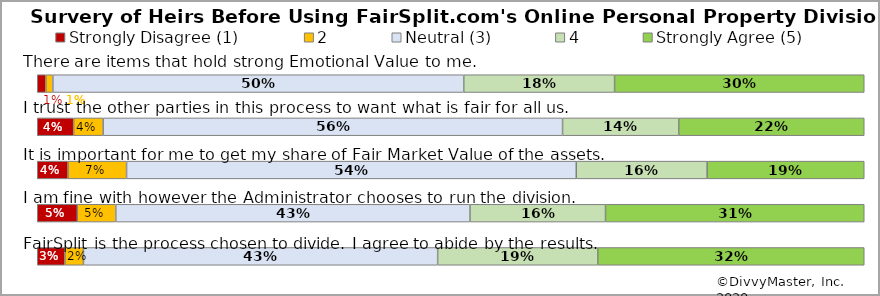
| Category | Strongly Disagree (1) | 2 | Neutral (3) | 4 | Strongly Agree (5) |
|---|---|---|---|---|---|
| There are items that hold strong Emotional Value to me. | 0.034 | 0.022 | 0.428 | 0.194 | 0.322 |
| I trust the other parties in this process to want what is fair for all us.  | 0.048 | 0.047 | 0.428 | 0.164 | 0.313 |
| It is important for me to get my share of Fair Market Value of the assets. | 0.037 | 0.071 | 0.544 | 0.158 | 0.19 |
| I am fine with however the Administrator chooses to run the division. | 0.044 | 0.036 | 0.556 | 0.14 | 0.224 |
| FairSplit is the process selected to divide. I agree to abide by the results.  | 0.01 | 0.008 | 0.497 | 0.182 | 0.302 |